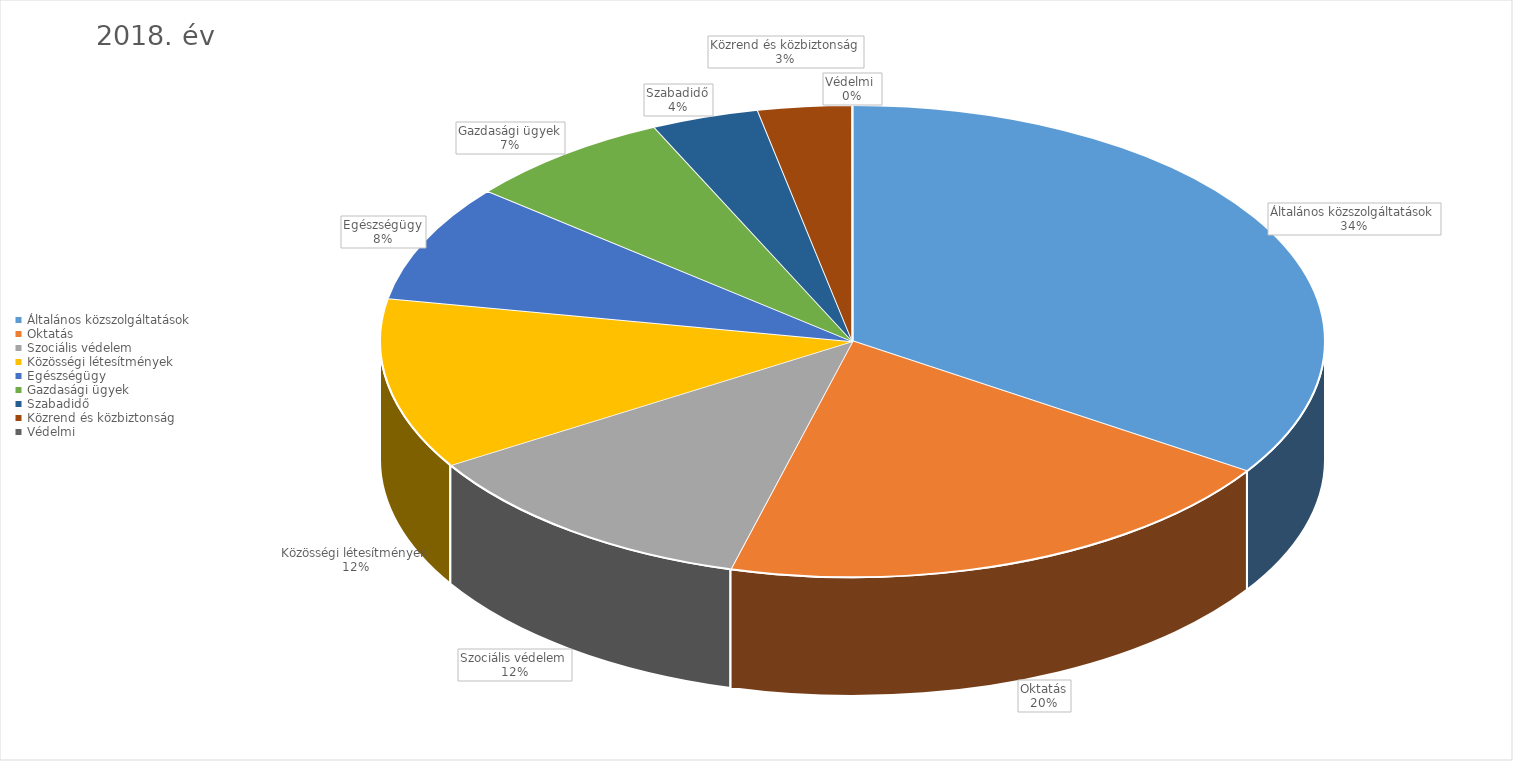
| Category | 2018. év |
|---|---|
| Általános közszolgáltatások | 10187464082 |
| Oktatás | 5905825500 |
| Szociális védelem | 3579929600 |
| Közösségi létesítmények | 3478294054 |
| Egészségügy | 2395275486 |
| Gazdasági ügyek | 2120133501 |
| Szabadidő | 1093743164 |
| Közrend és közbiztonság | 954370373 |
| Védelmi  | 2400000 |